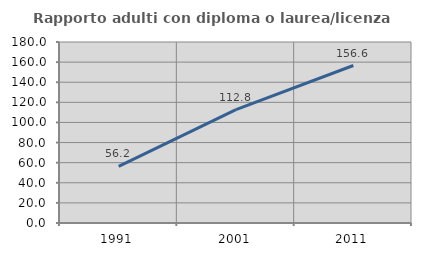
| Category | Rapporto adulti con diploma o laurea/licenza media  |
|---|---|
| 1991.0 | 56.219 |
| 2001.0 | 112.805 |
| 2011.0 | 156.604 |